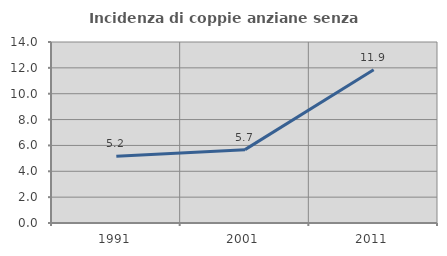
| Category | Incidenza di coppie anziane senza figli  |
|---|---|
| 1991.0 | 5.162 |
| 2001.0 | 5.674 |
| 2011.0 | 11.854 |